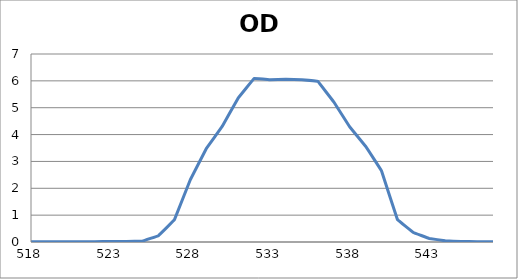
| Category | Series 0 |
|---|---|
| 2600.0 | 0.178 |
| 2599.0 | 0.178 |
| 2598.0 | 0.178 |
| 2597.0 | 0.178 |
| 2596.0 | 0.179 |
| 2595.0 | 0.179 |
| 2594.0 | 0.18 |
| 2593.0 | 0.181 |
| 2592.0 | 0.181 |
| 2591.0 | 0.182 |
| 2590.0 | 0.183 |
| 2589.0 | 0.183 |
| 2588.0 | 0.183 |
| 2587.0 | 0.184 |
| 2586.0 | 0.185 |
| 2585.0 | 0.186 |
| 2584.0 | 0.187 |
| 2583.0 | 0.188 |
| 2582.0 | 0.188 |
| 2581.0 | 0.189 |
| 2580.0 | 0.189 |
| 2579.0 | 0.189 |
| 2578.0 | 0.19 |
| 2577.0 | 0.19 |
| 2576.0 | 0.19 |
| 2575.0 | 0.19 |
| 2574.0 | 0.19 |
| 2573.0 | 0.19 |
| 2572.0 | 0.189 |
| 2571.0 | 0.189 |
| 2570.0 | 0.188 |
| 2569.0 | 0.187 |
| 2568.0 | 0.186 |
| 2567.0 | 0.184 |
| 2566.0 | 0.183 |
| 2565.0 | 0.182 |
| 2564.0 | 0.18 |
| 2563.0 | 0.179 |
| 2562.0 | 0.177 |
| 2561.0 | 0.175 |
| 2560.0 | 0.174 |
| 2559.0 | 0.172 |
| 2558.0 | 0.17 |
| 2557.0 | 0.168 |
| 2556.0 | 0.166 |
| 2555.0 | 0.164 |
| 2554.0 | 0.162 |
| 2553.0 | 0.16 |
| 2552.0 | 0.157 |
| 2551.0 | 0.155 |
| 2550.0 | 0.152 |
| 2549.0 | 0.149 |
| 2548.0 | 0.146 |
| 2547.0 | 0.143 |
| 2546.0 | 0.141 |
| 2545.0 | 0.139 |
| 2544.0 | 0.136 |
| 2543.0 | 0.134 |
| 2542.0 | 0.132 |
| 2541.0 | 0.13 |
| 2540.0 | 0.129 |
| 2539.0 | 0.128 |
| 2538.0 | 0.126 |
| 2537.0 | 0.125 |
| 2536.0 | 0.124 |
| 2535.0 | 0.122 |
| 2534.0 | 0.122 |
| 2533.0 | 0.121 |
| 2532.0 | 0.12 |
| 2531.0 | 0.119 |
| 2530.0 | 0.119 |
| 2529.0 | 0.119 |
| 2528.0 | 0.119 |
| 2527.0 | 0.118 |
| 2526.0 | 0.119 |
| 2525.0 | 0.119 |
| 2524.0 | 0.119 |
| 2523.0 | 0.119 |
| 2522.0 | 0.119 |
| 2521.0 | 0.12 |
| 2520.0 | 0.12 |
| 2519.0 | 0.121 |
| 2518.0 | 0.122 |
| 2517.0 | 0.122 |
| 2516.0 | 0.123 |
| 2515.0 | 0.123 |
| 2514.0 | 0.124 |
| 2513.0 | 0.124 |
| 2512.0 | 0.124 |
| 2511.0 | 0.125 |
| 2510.0 | 0.125 |
| 2509.0 | 0.125 |
| 2508.0 | 0.125 |
| 2507.0 | 0.125 |
| 2506.0 | 0.125 |
| 2505.0 | 0.125 |
| 2504.0 | 0.125 |
| 2503.0 | 0.124 |
| 2502.0 | 0.124 |
| 2501.0 | 0.123 |
| 2500.0 | 0.123 |
| 2499.0 | 0.122 |
| 2498.0 | 0.121 |
| 2497.0 | 0.119 |
| 2496.0 | 0.118 |
| 2495.0 | 0.117 |
| 2494.0 | 0.116 |
| 2493.0 | 0.115 |
| 2492.0 | 0.113 |
| 2491.0 | 0.112 |
| 2490.0 | 0.11 |
| 2489.0 | 0.108 |
| 2488.0 | 0.107 |
| 2487.0 | 0.105 |
| 2486.0 | 0.103 |
| 2485.0 | 0.102 |
| 2484.0 | 0.1 |
| 2483.0 | 0.098 |
| 2482.0 | 0.096 |
| 2481.0 | 0.095 |
| 2480.0 | 0.093 |
| 2479.0 | 0.091 |
| 2478.0 | 0.09 |
| 2477.0 | 0.088 |
| 2476.0 | 0.087 |
| 2475.0 | 0.085 |
| 2474.0 | 0.084 |
| 2473.0 | 0.082 |
| 2472.0 | 0.081 |
| 2471.0 | 0.08 |
| 2470.0 | 0.079 |
| 2469.0 | 0.078 |
| 2468.0 | 0.077 |
| 2467.0 | 0.076 |
| 2466.0 | 0.076 |
| 2465.0 | 0.075 |
| 2464.0 | 0.074 |
| 2463.0 | 0.074 |
| 2462.0 | 0.073 |
| 2461.0 | 0.073 |
| 2460.0 | 0.073 |
| 2459.0 | 0.073 |
| 2458.0 | 0.073 |
| 2457.0 | 0.072 |
| 2456.0 | 0.072 |
| 2455.0 | 0.072 |
| 2454.0 | 0.072 |
| 2453.0 | 0.072 |
| 2452.0 | 0.072 |
| 2451.0 | 0.073 |
| 2450.0 | 0.073 |
| 2449.0 | 0.073 |
| 2448.0 | 0.073 |
| 2447.0 | 0.073 |
| 2446.0 | 0.073 |
| 2445.0 | 0.073 |
| 2444.0 | 0.073 |
| 2443.0 | 0.073 |
| 2442.0 | 0.073 |
| 2441.0 | 0.073 |
| 2440.0 | 0.073 |
| 2439.0 | 0.074 |
| 2438.0 | 0.074 |
| 2437.0 | 0.074 |
| 2436.0 | 0.074 |
| 2435.0 | 0.074 |
| 2434.0 | 0.074 |
| 2433.0 | 0.074 |
| 2432.0 | 0.074 |
| 2431.0 | 0.074 |
| 2430.0 | 0.075 |
| 2429.0 | 0.075 |
| 2428.0 | 0.075 |
| 2427.0 | 0.075 |
| 2426.0 | 0.075 |
| 2425.0 | 0.076 |
| 2424.0 | 0.076 |
| 2423.0 | 0.076 |
| 2422.0 | 0.077 |
| 2421.0 | 0.077 |
| 2420.0 | 0.078 |
| 2419.0 | 0.078 |
| 2418.0 | 0.078 |
| 2417.0 | 0.079 |
| 2416.0 | 0.079 |
| 2415.0 | 0.079 |
| 2414.0 | 0.08 |
| 2413.0 | 0.08 |
| 2412.0 | 0.081 |
| 2411.0 | 0.081 |
| 2410.0 | 0.082 |
| 2409.0 | 0.082 |
| 2408.0 | 0.082 |
| 2407.0 | 0.082 |
| 2406.0 | 0.082 |
| 2405.0 | 0.082 |
| 2404.0 | 0.082 |
| 2403.0 | 0.082 |
| 2402.0 | 0.082 |
| 2401.0 | 0.082 |
| 2400.0 | 0.082 |
| 2399.0 | 0.082 |
| 2398.0 | 0.081 |
| 2397.0 | 0.081 |
| 2396.0 | 0.08 |
| 2395.0 | 0.08 |
| 2394.0 | 0.079 |
| 2393.0 | 0.078 |
| 2392.0 | 0.078 |
| 2391.0 | 0.077 |
| 2390.0 | 0.076 |
| 2389.0 | 0.076 |
| 2388.0 | 0.075 |
| 2387.0 | 0.074 |
| 2386.0 | 0.073 |
| 2385.0 | 0.072 |
| 2384.0 | 0.072 |
| 2383.0 | 0.071 |
| 2382.0 | 0.071 |
| 2381.0 | 0.071 |
| 2380.0 | 0.07 |
| 2379.0 | 0.07 |
| 2378.0 | 0.07 |
| 2377.0 | 0.07 |
| 2376.0 | 0.07 |
| 2375.0 | 0.071 |
| 2374.0 | 0.071 |
| 2373.0 | 0.072 |
| 2372.0 | 0.073 |
| 2371.0 | 0.074 |
| 2370.0 | 0.075 |
| 2369.0 | 0.077 |
| 2368.0 | 0.078 |
| 2367.0 | 0.08 |
| 2366.0 | 0.082 |
| 2365.0 | 0.084 |
| 2364.0 | 0.086 |
| 2363.0 | 0.088 |
| 2362.0 | 0.09 |
| 2361.0 | 0.093 |
| 2360.0 | 0.095 |
| 2359.0 | 0.098 |
| 2358.0 | 0.1 |
| 2357.0 | 0.103 |
| 2356.0 | 0.106 |
| 2355.0 | 0.108 |
| 2354.0 | 0.111 |
| 2353.0 | 0.113 |
| 2352.0 | 0.115 |
| 2351.0 | 0.118 |
| 2350.0 | 0.12 |
| 2349.0 | 0.122 |
| 2348.0 | 0.124 |
| 2347.0 | 0.125 |
| 2346.0 | 0.126 |
| 2345.0 | 0.128 |
| 2344.0 | 0.129 |
| 2343.0 | 0.129 |
| 2342.0 | 0.13 |
| 2341.0 | 0.13 |
| 2340.0 | 0.13 |
| 2339.0 | 0.13 |
| 2338.0 | 0.13 |
| 2337.0 | 0.129 |
| 2336.0 | 0.129 |
| 2335.0 | 0.128 |
| 2334.0 | 0.127 |
| 2333.0 | 0.126 |
| 2332.0 | 0.124 |
| 2331.0 | 0.122 |
| 2330.0 | 0.121 |
| 2329.0 | 0.119 |
| 2328.0 | 0.118 |
| 2327.0 | 0.116 |
| 2326.0 | 0.114 |
| 2325.0 | 0.112 |
| 2324.0 | 0.11 |
| 2323.0 | 0.108 |
| 2322.0 | 0.107 |
| 2321.0 | 0.105 |
| 2320.0 | 0.104 |
| 2319.0 | 0.103 |
| 2318.0 | 0.101 |
| 2317.0 | 0.101 |
| 2316.0 | 0.1 |
| 2315.0 | 0.099 |
| 2314.0 | 0.099 |
| 2313.0 | 0.099 |
| 2312.0 | 0.1 |
| 2311.0 | 0.1 |
| 2310.0 | 0.101 |
| 2309.0 | 0.102 |
| 2308.0 | 0.103 |
| 2307.0 | 0.105 |
| 2306.0 | 0.107 |
| 2305.0 | 0.109 |
| 2304.0 | 0.111 |
| 2303.0 | 0.113 |
| 2302.0 | 0.116 |
| 2301.0 | 0.118 |
| 2300.0 | 0.121 |
| 2299.0 | 0.124 |
| 2298.0 | 0.126 |
| 2297.0 | 0.129 |
| 2296.0 | 0.131 |
| 2295.0 | 0.134 |
| 2294.0 | 0.136 |
| 2293.0 | 0.138 |
| 2292.0 | 0.14 |
| 2291.0 | 0.142 |
| 2290.0 | 0.144 |
| 2289.0 | 0.146 |
| 2288.0 | 0.147 |
| 2287.0 | 0.148 |
| 2286.0 | 0.149 |
| 2285.0 | 0.15 |
| 2284.0 | 0.151 |
| 2283.0 | 0.151 |
| 2282.0 | 0.151 |
| 2281.0 | 0.151 |
| 2280.0 | 0.151 |
| 2279.0 | 0.15 |
| 2278.0 | 0.15 |
| 2277.0 | 0.149 |
| 2276.0 | 0.148 |
| 2275.0 | 0.147 |
| 2274.0 | 0.146 |
| 2273.0 | 0.145 |
| 2272.0 | 0.144 |
| 2271.0 | 0.143 |
| 2270.0 | 0.142 |
| 2269.0 | 0.141 |
| 2268.0 | 0.141 |
| 2267.0 | 0.14 |
| 2266.0 | 0.14 |
| 2265.0 | 0.14 |
| 2264.0 | 0.14 |
| 2263.0 | 0.14 |
| 2262.0 | 0.141 |
| 2261.0 | 0.142 |
| 2260.0 | 0.143 |
| 2259.0 | 0.144 |
| 2258.0 | 0.146 |
| 2257.0 | 0.148 |
| 2256.0 | 0.15 |
| 2255.0 | 0.152 |
| 2254.0 | 0.155 |
| 2253.0 | 0.158 |
| 2252.0 | 0.161 |
| 2251.0 | 0.164 |
| 2250.0 | 0.167 |
| 2249.0 | 0.17 |
| 2248.0 | 0.173 |
| 2247.0 | 0.176 |
| 2246.0 | 0.18 |
| 2245.0 | 0.183 |
| 2244.0 | 0.186 |
| 2243.0 | 0.189 |
| 2242.0 | 0.192 |
| 2241.0 | 0.194 |
| 2240.0 | 0.196 |
| 2239.0 | 0.198 |
| 2238.0 | 0.2 |
| 2237.0 | 0.202 |
| 2236.0 | 0.204 |
| 2235.0 | 0.205 |
| 2234.0 | 0.206 |
| 2233.0 | 0.207 |
| 2232.0 | 0.207 |
| 2231.0 | 0.207 |
| 2230.0 | 0.207 |
| 2229.0 | 0.208 |
| 2228.0 | 0.207 |
| 2227.0 | 0.207 |
| 2226.0 | 0.206 |
| 2225.0 | 0.206 |
| 2224.0 | 0.205 |
| 2223.0 | 0.205 |
| 2222.0 | 0.204 |
| 2221.0 | 0.203 |
| 2220.0 | 0.203 |
| 2219.0 | 0.202 |
| 2218.0 | 0.201 |
| 2217.0 | 0.201 |
| 2216.0 | 0.2 |
| 2215.0 | 0.199 |
| 2214.0 | 0.199 |
| 2213.0 | 0.198 |
| 2212.0 | 0.198 |
| 2211.0 | 0.197 |
| 2210.0 | 0.197 |
| 2209.0 | 0.196 |
| 2208.0 | 0.195 |
| 2207.0 | 0.194 |
| 2206.0 | 0.194 |
| 2205.0 | 0.192 |
| 2204.0 | 0.191 |
| 2203.0 | 0.19 |
| 2202.0 | 0.189 |
| 2201.0 | 0.188 |
| 2200.0 | 0.187 |
| 2199.0 | 0.186 |
| 2198.0 | 0.185 |
| 2197.0 | 0.184 |
| 2196.0 | 0.184 |
| 2195.0 | 0.184 |
| 2194.0 | 0.184 |
| 2193.0 | 0.183 |
| 2192.0 | 0.183 |
| 2191.0 | 0.183 |
| 2190.0 | 0.183 |
| 2189.0 | 0.183 |
| 2188.0 | 0.184 |
| 2187.0 | 0.183 |
| 2186.0 | 0.183 |
| 2185.0 | 0.182 |
| 2184.0 | 0.182 |
| 2183.0 | 0.181 |
| 2182.0 | 0.18 |
| 2181.0 | 0.179 |
| 2180.0 | 0.178 |
| 2179.0 | 0.177 |
| 2178.0 | 0.175 |
| 2177.0 | 0.173 |
| 2176.0 | 0.171 |
| 2175.0 | 0.17 |
| 2174.0 | 0.168 |
| 2173.0 | 0.165 |
| 2172.0 | 0.163 |
| 2171.0 | 0.162 |
| 2170.0 | 0.16 |
| 2169.0 | 0.158 |
| 2168.0 | 0.157 |
| 2167.0 | 0.155 |
| 2166.0 | 0.154 |
| 2165.0 | 0.153 |
| 2164.0 | 0.153 |
| 2163.0 | 0.152 |
| 2162.0 | 0.152 |
| 2161.0 | 0.152 |
| 2160.0 | 0.153 |
| 2159.0 | 0.153 |
| 2158.0 | 0.154 |
| 2157.0 | 0.156 |
| 2156.0 | 0.157 |
| 2155.0 | 0.159 |
| 2154.0 | 0.161 |
| 2153.0 | 0.163 |
| 2152.0 | 0.164 |
| 2151.0 | 0.166 |
| 2150.0 | 0.168 |
| 2149.0 | 0.17 |
| 2148.0 | 0.172 |
| 2147.0 | 0.173 |
| 2146.0 | 0.175 |
| 2145.0 | 0.176 |
| 2144.0 | 0.176 |
| 2143.0 | 0.177 |
| 2142.0 | 0.177 |
| 2141.0 | 0.177 |
| 2140.0 | 0.176 |
| 2139.0 | 0.175 |
| 2138.0 | 0.173 |
| 2137.0 | 0.171 |
| 2136.0 | 0.169 |
| 2135.0 | 0.167 |
| 2134.0 | 0.164 |
| 2133.0 | 0.161 |
| 2132.0 | 0.157 |
| 2131.0 | 0.153 |
| 2130.0 | 0.15 |
| 2129.0 | 0.146 |
| 2128.0 | 0.142 |
| 2127.0 | 0.138 |
| 2126.0 | 0.134 |
| 2125.0 | 0.13 |
| 2124.0 | 0.126 |
| 2123.0 | 0.122 |
| 2122.0 | 0.119 |
| 2121.0 | 0.116 |
| 2120.0 | 0.114 |
| 2119.0 | 0.112 |
| 2118.0 | 0.111 |
| 2117.0 | 0.111 |
| 2116.0 | 0.111 |
| 2115.0 | 0.112 |
| 2114.0 | 0.113 |
| 2113.0 | 0.115 |
| 2112.0 | 0.118 |
| 2111.0 | 0.122 |
| 2110.0 | 0.125 |
| 2109.0 | 0.13 |
| 2108.0 | 0.135 |
| 2107.0 | 0.14 |
| 2106.0 | 0.145 |
| 2105.0 | 0.15 |
| 2104.0 | 0.155 |
| 2103.0 | 0.161 |
| 2102.0 | 0.166 |
| 2101.0 | 0.171 |
| 2100.0 | 0.175 |
| 2099.0 | 0.179 |
| 2098.0 | 0.183 |
| 2097.0 | 0.187 |
| 2096.0 | 0.189 |
| 2095.0 | 0.192 |
| 2094.0 | 0.193 |
| 2093.0 | 0.195 |
| 2092.0 | 0.195 |
| 2091.0 | 0.195 |
| 2090.0 | 0.194 |
| 2089.0 | 0.193 |
| 2088.0 | 0.191 |
| 2087.0 | 0.189 |
| 2086.0 | 0.186 |
| 2085.0 | 0.182 |
| 2084.0 | 0.178 |
| 2083.0 | 0.174 |
| 2082.0 | 0.169 |
| 2081.0 | 0.164 |
| 2080.0 | 0.159 |
| 2079.0 | 0.154 |
| 2078.0 | 0.149 |
| 2077.0 | 0.144 |
| 2076.0 | 0.139 |
| 2075.0 | 0.134 |
| 2074.0 | 0.13 |
| 2073.0 | 0.126 |
| 2072.0 | 0.123 |
| 2071.0 | 0.121 |
| 2070.0 | 0.119 |
| 2069.0 | 0.117 |
| 2068.0 | 0.117 |
| 2067.0 | 0.117 |
| 2066.0 | 0.118 |
| 2065.0 | 0.12 |
| 2064.0 | 0.122 |
| 2063.0 | 0.125 |
| 2062.0 | 0.128 |
| 2061.0 | 0.132 |
| 2060.0 | 0.135 |
| 2059.0 | 0.139 |
| 2058.0 | 0.143 |
| 2057.0 | 0.147 |
| 2056.0 | 0.151 |
| 2055.0 | 0.155 |
| 2054.0 | 0.158 |
| 2053.0 | 0.161 |
| 2052.0 | 0.164 |
| 2051.0 | 0.167 |
| 2050.0 | 0.168 |
| 2049.0 | 0.169 |
| 2048.0 | 0.17 |
| 2047.0 | 0.171 |
| 2046.0 | 0.17 |
| 2045.0 | 0.169 |
| 2044.0 | 0.168 |
| 2043.0 | 0.165 |
| 2042.0 | 0.163 |
| 2041.0 | 0.16 |
| 2040.0 | 0.156 |
| 2039.0 | 0.152 |
| 2038.0 | 0.148 |
| 2037.0 | 0.144 |
| 2036.0 | 0.139 |
| 2035.0 | 0.135 |
| 2034.0 | 0.131 |
| 2033.0 | 0.127 |
| 2032.0 | 0.123 |
| 2031.0 | 0.119 |
| 2030.0 | 0.116 |
| 2029.0 | 0.114 |
| 2028.0 | 0.112 |
| 2027.0 | 0.111 |
| 2026.0 | 0.11 |
| 2025.0 | 0.11 |
| 2024.0 | 0.111 |
| 2023.0 | 0.113 |
| 2022.0 | 0.115 |
| 2021.0 | 0.117 |
| 2020.0 | 0.121 |
| 2019.0 | 0.124 |
| 2018.0 | 0.128 |
| 2017.0 | 0.132 |
| 2016.0 | 0.135 |
| 2015.0 | 0.139 |
| 2014.0 | 0.143 |
| 2013.0 | 0.147 |
| 2012.0 | 0.15 |
| 2011.0 | 0.153 |
| 2010.0 | 0.156 |
| 2009.0 | 0.158 |
| 2008.0 | 0.16 |
| 2007.0 | 0.161 |
| 2006.0 | 0.162 |
| 2005.0 | 0.163 |
| 2004.0 | 0.162 |
| 2003.0 | 0.162 |
| 2002.0 | 0.161 |
| 2001.0 | 0.16 |
| 2000.0 | 0.158 |
| 1999.0 | 0.156 |
| 1998.0 | 0.154 |
| 1997.0 | 0.152 |
| 1996.0 | 0.15 |
| 1995.0 | 0.147 |
| 1994.0 | 0.146 |
| 1993.0 | 0.145 |
| 1992.0 | 0.144 |
| 1991.0 | 0.144 |
| 1990.0 | 0.144 |
| 1989.0 | 0.146 |
| 1988.0 | 0.148 |
| 1987.0 | 0.151 |
| 1986.0 | 0.155 |
| 1985.0 | 0.159 |
| 1984.0 | 0.165 |
| 1983.0 | 0.171 |
| 1982.0 | 0.177 |
| 1981.0 | 0.184 |
| 1980.0 | 0.192 |
| 1979.0 | 0.199 |
| 1978.0 | 0.207 |
| 1977.0 | 0.215 |
| 1976.0 | 0.222 |
| 1975.0 | 0.229 |
| 1974.0 | 0.236 |
| 1973.0 | 0.243 |
| 1972.0 | 0.249 |
| 1971.0 | 0.255 |
| 1970.0 | 0.259 |
| 1969.0 | 0.264 |
| 1968.0 | 0.267 |
| 1967.0 | 0.269 |
| 1966.0 | 0.27 |
| 1965.0 | 0.271 |
| 1964.0 | 0.271 |
| 1963.0 | 0.269 |
| 1962.0 | 0.267 |
| 1961.0 | 0.264 |
| 1960.0 | 0.259 |
| 1959.0 | 0.254 |
| 1958.0 | 0.248 |
| 1957.0 | 0.241 |
| 1956.0 | 0.234 |
| 1955.0 | 0.226 |
| 1954.0 | 0.218 |
| 1953.0 | 0.21 |
| 1952.0 | 0.201 |
| 1951.0 | 0.193 |
| 1950.0 | 0.184 |
| 1949.0 | 0.177 |
| 1948.0 | 0.169 |
| 1947.0 | 0.162 |
| 1946.0 | 0.156 |
| 1945.0 | 0.151 |
| 1944.0 | 0.147 |
| 1943.0 | 0.144 |
| 1942.0 | 0.142 |
| 1941.0 | 0.141 |
| 1940.0 | 0.141 |
| 1939.0 | 0.142 |
| 1938.0 | 0.144 |
| 1937.0 | 0.146 |
| 1936.0 | 0.149 |
| 1935.0 | 0.152 |
| 1934.0 | 0.156 |
| 1933.0 | 0.159 |
| 1932.0 | 0.163 |
| 1931.0 | 0.167 |
| 1930.0 | 0.171 |
| 1929.0 | 0.175 |
| 1928.0 | 0.178 |
| 1927.0 | 0.181 |
| 1926.0 | 0.184 |
| 1925.0 | 0.186 |
| 1924.0 | 0.187 |
| 1923.0 | 0.187 |
| 1922.0 | 0.187 |
| 1921.0 | 0.187 |
| 1920.0 | 0.186 |
| 1919.0 | 0.184 |
| 1918.0 | 0.182 |
| 1917.0 | 0.179 |
| 1916.0 | 0.176 |
| 1915.0 | 0.172 |
| 1914.0 | 0.168 |
| 1913.0 | 0.164 |
| 1912.0 | 0.16 |
| 1911.0 | 0.155 |
| 1910.0 | 0.151 |
| 1909.0 | 0.147 |
| 1908.0 | 0.143 |
| 1907.0 | 0.139 |
| 1906.0 | 0.135 |
| 1905.0 | 0.131 |
| 1904.0 | 0.128 |
| 1903.0 | 0.125 |
| 1902.0 | 0.122 |
| 1901.0 | 0.119 |
| 1900.0 | 0.116 |
| 1899.0 | 0.113 |
| 1898.0 | 0.111 |
| 1897.0 | 0.108 |
| 1896.0 | 0.105 |
| 1895.0 | 0.103 |
| 1894.0 | 0.099 |
| 1893.0 | 0.096 |
| 1892.0 | 0.093 |
| 1891.0 | 0.09 |
| 1890.0 | 0.087 |
| 1889.0 | 0.083 |
| 1888.0 | 0.08 |
| 1887.0 | 0.076 |
| 1886.0 | 0.073 |
| 1885.0 | 0.07 |
| 1884.0 | 0.067 |
| 1883.0 | 0.064 |
| 1882.0 | 0.062 |
| 1881.0 | 0.06 |
| 1880.0 | 0.059 |
| 1879.0 | 0.059 |
| 1878.0 | 0.06 |
| 1877.0 | 0.062 |
| 1876.0 | 0.065 |
| 1875.0 | 0.069 |
| 1874.0 | 0.075 |
| 1873.0 | 0.081 |
| 1872.0 | 0.089 |
| 1871.0 | 0.096 |
| 1870.0 | 0.104 |
| 1869.0 | 0.113 |
| 1868.0 | 0.122 |
| 1867.0 | 0.13 |
| 1866.0 | 0.138 |
| 1865.0 | 0.145 |
| 1864.0 | 0.151 |
| 1863.0 | 0.157 |
| 1862.0 | 0.163 |
| 1861.0 | 0.169 |
| 1860.0 | 0.173 |
| 1859.0 | 0.177 |
| 1858.0 | 0.179 |
| 1857.0 | 0.179 |
| 1856.0 | 0.179 |
| 1855.0 | 0.177 |
| 1854.0 | 0.174 |
| 1853.0 | 0.17 |
| 1852.0 | 0.165 |
| 1851.0 | 0.16 |
| 1850.0 | 0.154 |
| 1849.0 | 0.145 |
| 1848.0 | 0.135 |
| 1847.0 | 0.125 |
| 1846.0 | 0.115 |
| 1845.0 | 0.108 |
| 1844.0 | 0.099 |
| 1843.0 | 0.09 |
| 1842.0 | 0.081 |
| 1841.0 | 0.073 |
| 1840.0 | 0.066 |
| 1839.0 | 0.061 |
| 1838.0 | 0.057 |
| 1837.0 | 0.054 |
| 1836.0 | 0.054 |
| 1835.0 | 0.054 |
| 1834.0 | 0.056 |
| 1833.0 | 0.059 |
| 1832.0 | 0.063 |
| 1831.0 | 0.069 |
| 1830.0 | 0.075 |
| 1829.0 | 0.083 |
| 1828.0 | 0.089 |
| 1827.0 | 0.096 |
| 1826.0 | 0.103 |
| 1825.0 | 0.109 |
| 1824.0 | 0.114 |
| 1823.0 | 0.117 |
| 1822.0 | 0.121 |
| 1821.0 | 0.124 |
| 1820.0 | 0.126 |
| 1819.0 | 0.127 |
| 1818.0 | 0.126 |
| 1817.0 | 0.124 |
| 1816.0 | 0.121 |
| 1815.0 | 0.117 |
| 1814.0 | 0.112 |
| 1813.0 | 0.107 |
| 1812.0 | 0.101 |
| 1811.0 | 0.094 |
| 1810.0 | 0.087 |
| 1809.0 | 0.081 |
| 1808.0 | 0.074 |
| 1807.0 | 0.069 |
| 1806.0 | 0.063 |
| 1805.0 | 0.058 |
| 1804.0 | 0.054 |
| 1803.0 | 0.051 |
| 1802.0 | 0.049 |
| 1801.0 | 0.048 |
| 1800.0 | 0.049 |
| 1799.0 | 0.051 |
| 1798.0 | 0.054 |
| 1797.0 | 0.057 |
| 1796.0 | 0.061 |
| 1795.0 | 0.066 |
| 1794.0 | 0.071 |
| 1793.0 | 0.077 |
| 1792.0 | 0.082 |
| 1791.0 | 0.087 |
| 1790.0 | 0.091 |
| 1789.0 | 0.094 |
| 1788.0 | 0.097 |
| 1787.0 | 0.099 |
| 1786.0 | 0.101 |
| 1785.0 | 0.101 |
| 1784.0 | 0.101 |
| 1783.0 | 0.099 |
| 1782.0 | 0.097 |
| 1781.0 | 0.095 |
| 1780.0 | 0.091 |
| 1779.0 | 0.088 |
| 1778.0 | 0.084 |
| 1777.0 | 0.08 |
| 1776.0 | 0.077 |
| 1775.0 | 0.073 |
| 1774.0 | 0.071 |
| 1773.0 | 0.068 |
| 1772.0 | 0.067 |
| 1771.0 | 0.066 |
| 1770.0 | 0.066 |
| 1769.0 | 0.067 |
| 1768.0 | 0.069 |
| 1767.0 | 0.071 |
| 1766.0 | 0.075 |
| 1765.0 | 0.079 |
| 1764.0 | 0.083 |
| 1763.0 | 0.088 |
| 1762.0 | 0.093 |
| 1761.0 | 0.098 |
| 1760.0 | 0.103 |
| 1759.0 | 0.108 |
| 1758.0 | 0.112 |
| 1757.0 | 0.115 |
| 1756.0 | 0.118 |
| 1755.0 | 0.12 |
| 1754.0 | 0.121 |
| 1753.0 | 0.121 |
| 1752.0 | 0.121 |
| 1751.0 | 0.119 |
| 1750.0 | 0.117 |
| 1749.0 | 0.114 |
| 1748.0 | 0.111 |
| 1747.0 | 0.107 |
| 1746.0 | 0.103 |
| 1745.0 | 0.098 |
| 1744.0 | 0.094 |
| 1743.0 | 0.089 |
| 1742.0 | 0.085 |
| 1741.0 | 0.081 |
| 1740.0 | 0.078 |
| 1739.0 | 0.075 |
| 1738.0 | 0.072 |
| 1737.0 | 0.07 |
| 1736.0 | 0.069 |
| 1735.0 | 0.068 |
| 1734.0 | 0.068 |
| 1733.0 | 0.067 |
| 1732.0 | 0.067 |
| 1731.0 | 0.068 |
| 1730.0 | 0.068 |
| 1729.0 | 0.068 |
| 1728.0 | 0.068 |
| 1727.0 | 0.068 |
| 1726.0 | 0.067 |
| 1725.0 | 0.067 |
| 1724.0 | 0.066 |
| 1723.0 | 0.064 |
| 1722.0 | 0.063 |
| 1721.0 | 0.061 |
| 1720.0 | 0.058 |
| 1719.0 | 0.056 |
| 1718.0 | 0.053 |
| 1717.0 | 0.051 |
| 1716.0 | 0.048 |
| 1715.0 | 0.046 |
| 1714.0 | 0.044 |
| 1713.0 | 0.042 |
| 1712.0 | 0.041 |
| 1711.0 | 0.041 |
| 1710.0 | 0.04 |
| 1709.0 | 0.04 |
| 1708.0 | 0.041 |
| 1707.0 | 0.042 |
| 1706.0 | 0.043 |
| 1705.0 | 0.045 |
| 1704.0 | 0.046 |
| 1703.0 | 0.048 |
| 1702.0 | 0.049 |
| 1701.0 | 0.05 |
| 1700.0 | 0.051 |
| 1699.0 | 0.051 |
| 1698.0 | 0.051 |
| 1697.0 | 0.051 |
| 1696.0 | 0.051 |
| 1695.0 | 0.05 |
| 1694.0 | 0.049 |
| 1693.0 | 0.048 |
| 1692.0 | 0.047 |
| 1691.0 | 0.046 |
| 1690.0 | 0.045 |
| 1689.0 | 0.045 |
| 1688.0 | 0.045 |
| 1687.0 | 0.045 |
| 1686.0 | 0.046 |
| 1685.0 | 0.048 |
| 1684.0 | 0.051 |
| 1683.0 | 0.054 |
| 1682.0 | 0.058 |
| 1681.0 | 0.063 |
| 1680.0 | 0.068 |
| 1679.0 | 0.073 |
| 1678.0 | 0.078 |
| 1677.0 | 0.083 |
| 1676.0 | 0.087 |
| 1675.0 | 0.092 |
| 1674.0 | 0.095 |
| 1673.0 | 0.098 |
| 1672.0 | 0.099 |
| 1671.0 | 0.1 |
| 1670.0 | 0.099 |
| 1669.0 | 0.098 |
| 1668.0 | 0.095 |
| 1667.0 | 0.092 |
| 1666.0 | 0.087 |
| 1665.0 | 0.083 |
| 1664.0 | 0.077 |
| 1663.0 | 0.072 |
| 1662.0 | 0.067 |
| 1661.0 | 0.062 |
| 1660.0 | 0.057 |
| 1659.0 | 0.054 |
| 1658.0 | 0.051 |
| 1657.0 | 0.05 |
| 1656.0 | 0.049 |
| 1655.0 | 0.05 |
| 1654.0 | 0.052 |
| 1653.0 | 0.055 |
| 1652.0 | 0.059 |
| 1651.0 | 0.064 |
| 1650.0 | 0.069 |
| 1649.0 | 0.075 |
| 1648.0 | 0.08 |
| 1647.0 | 0.085 |
| 1646.0 | 0.09 |
| 1645.0 | 0.094 |
| 1644.0 | 0.096 |
| 1643.0 | 0.098 |
| 1642.0 | 0.099 |
| 1641.0 | 0.098 |
| 1640.0 | 0.096 |
| 1639.0 | 0.093 |
| 1638.0 | 0.088 |
| 1637.0 | 0.083 |
| 1636.0 | 0.077 |
| 1635.0 | 0.07 |
| 1634.0 | 0.062 |
| 1633.0 | 0.055 |
| 1632.0 | 0.048 |
| 1631.0 | 0.042 |
| 1630.0 | 0.037 |
| 1629.0 | 0.033 |
| 1628.0 | 0.031 |
| 1627.0 | 0.029 |
| 1626.0 | 0.03 |
| 1625.0 | 0.031 |
| 1624.0 | 0.034 |
| 1623.0 | 0.037 |
| 1622.0 | 0.042 |
| 1621.0 | 0.046 |
| 1620.0 | 0.051 |
| 1619.0 | 0.055 |
| 1618.0 | 0.059 |
| 1617.0 | 0.063 |
| 1616.0 | 0.065 |
| 1615.0 | 0.067 |
| 1614.0 | 0.068 |
| 1613.0 | 0.068 |
| 1612.0 | 0.067 |
| 1611.0 | 0.065 |
| 1610.0 | 0.062 |
| 1609.0 | 0.059 |
| 1608.0 | 0.056 |
| 1607.0 | 0.053 |
| 1606.0 | 0.05 |
| 1605.0 | 0.047 |
| 1604.0 | 0.045 |
| 1603.0 | 0.044 |
| 1602.0 | 0.044 |
| 1601.0 | 0.044 |
| 1600.0 | 0.046 |
| 1599.0 | 0.049 |
| 1598.0 | 0.052 |
| 1597.0 | 0.056 |
| 1596.0 | 0.06 |
| 1595.0 | 0.064 |
| 1594.0 | 0.068 |
| 1593.0 | 0.072 |
| 1592.0 | 0.075 |
| 1591.0 | 0.077 |
| 1590.0 | 0.078 |
| 1589.0 | 0.078 |
| 1588.0 | 0.077 |
| 1587.0 | 0.075 |
| 1586.0 | 0.072 |
| 1585.0 | 0.069 |
| 1584.0 | 0.066 |
| 1583.0 | 0.062 |
| 1582.0 | 0.059 |
| 1581.0 | 0.056 |
| 1580.0 | 0.055 |
| 1579.0 | 0.054 |
| 1578.0 | 0.054 |
| 1577.0 | 0.056 |
| 1576.0 | 0.058 |
| 1575.0 | 0.062 |
| 1574.0 | 0.067 |
| 1573.0 | 0.072 |
| 1572.0 | 0.078 |
| 1571.0 | 0.083 |
| 1570.0 | 0.089 |
| 1569.0 | 0.094 |
| 1568.0 | 0.098 |
| 1567.0 | 0.102 |
| 1566.0 | 0.104 |
| 1565.0 | 0.105 |
| 1564.0 | 0.105 |
| 1563.0 | 0.103 |
| 1562.0 | 0.101 |
| 1561.0 | 0.097 |
| 1560.0 | 0.092 |
| 1559.0 | 0.087 |
| 1558.0 | 0.082 |
| 1557.0 | 0.077 |
| 1556.0 | 0.073 |
| 1555.0 | 0.07 |
| 1554.0 | 0.068 |
| 1553.0 | 0.068 |
| 1552.0 | 0.069 |
| 1551.0 | 0.073 |
| 1550.0 | 0.077 |
| 1549.0 | 0.083 |
| 1548.0 | 0.09 |
| 1547.0 | 0.097 |
| 1546.0 | 0.105 |
| 1545.0 | 0.112 |
| 1544.0 | 0.118 |
| 1543.0 | 0.123 |
| 1542.0 | 0.127 |
| 1541.0 | 0.129 |
| 1540.0 | 0.129 |
| 1539.0 | 0.128 |
| 1538.0 | 0.125 |
| 1537.0 | 0.121 |
| 1536.0 | 0.115 |
| 1535.0 | 0.108 |
| 1534.0 | 0.1 |
| 1533.0 | 0.092 |
| 1532.0 | 0.083 |
| 1531.0 | 0.075 |
| 1530.0 | 0.068 |
| 1529.0 | 0.062 |
| 1528.0 | 0.057 |
| 1527.0 | 0.054 |
| 1526.0 | 0.053 |
| 1525.0 | 0.053 |
| 1524.0 | 0.055 |
| 1523.0 | 0.058 |
| 1522.0 | 0.062 |
| 1521.0 | 0.066 |
| 1520.0 | 0.071 |
| 1519.0 | 0.076 |
| 1518.0 | 0.079 |
| 1517.0 | 0.082 |
| 1516.0 | 0.085 |
| 1515.0 | 0.086 |
| 1514.0 | 0.085 |
| 1513.0 | 0.084 |
| 1512.0 | 0.082 |
| 1511.0 | 0.08 |
| 1510.0 | 0.077 |
| 1509.0 | 0.074 |
| 1508.0 | 0.072 |
| 1507.0 | 0.069 |
| 1506.0 | 0.068 |
| 1505.0 | 0.068 |
| 1504.0 | 0.069 |
| 1503.0 | 0.07 |
| 1502.0 | 0.072 |
| 1501.0 | 0.075 |
| 1500.0 | 0.078 |
| 1499.0 | 0.081 |
| 1498.0 | 0.084 |
| 1497.0 | 0.086 |
| 1496.0 | 0.088 |
| 1495.0 | 0.09 |
| 1494.0 | 0.09 |
| 1493.0 | 0.091 |
| 1492.0 | 0.09 |
| 1491.0 | 0.09 |
| 1490.0 | 0.089 |
| 1489.0 | 0.088 |
| 1488.0 | 0.088 |
| 1487.0 | 0.088 |
| 1486.0 | 0.089 |
| 1485.0 | 0.092 |
| 1484.0 | 0.095 |
| 1483.0 | 0.099 |
| 1482.0 | 0.104 |
| 1481.0 | 0.11 |
| 1480.0 | 0.116 |
| 1479.0 | 0.123 |
| 1478.0 | 0.128 |
| 1477.0 | 0.134 |
| 1476.0 | 0.138 |
| 1475.0 | 0.14 |
| 1474.0 | 0.141 |
| 1473.0 | 0.14 |
| 1472.0 | 0.138 |
| 1471.0 | 0.135 |
| 1470.0 | 0.13 |
| 1469.0 | 0.125 |
| 1468.0 | 0.119 |
| 1467.0 | 0.114 |
| 1466.0 | 0.11 |
| 1465.0 | 0.107 |
| 1464.0 | 0.107 |
| 1463.0 | 0.108 |
| 1462.0 | 0.111 |
| 1461.0 | 0.116 |
| 1460.0 | 0.124 |
| 1459.0 | 0.132 |
| 1458.0 | 0.142 |
| 1457.0 | 0.151 |
| 1456.0 | 0.16 |
| 1455.0 | 0.168 |
| 1454.0 | 0.175 |
| 1453.0 | 0.18 |
| 1452.0 | 0.183 |
| 1451.0 | 0.184 |
| 1450.0 | 0.183 |
| 1449.0 | 0.179 |
| 1448.0 | 0.174 |
| 1447.0 | 0.166 |
| 1446.0 | 0.157 |
| 1445.0 | 0.148 |
| 1444.0 | 0.139 |
| 1443.0 | 0.131 |
| 1442.0 | 0.123 |
| 1441.0 | 0.117 |
| 1440.0 | 0.113 |
| 1439.0 | 0.112 |
| 1438.0 | 0.112 |
| 1437.0 | 0.115 |
| 1436.0 | 0.12 |
| 1435.0 | 0.125 |
| 1434.0 | 0.13 |
| 1433.0 | 0.136 |
| 1432.0 | 0.14 |
| 1431.0 | 0.144 |
| 1430.0 | 0.146 |
| 1429.0 | 0.147 |
| 1428.0 | 0.146 |
| 1427.0 | 0.144 |
| 1426.0 | 0.141 |
| 1425.0 | 0.138 |
| 1424.0 | 0.135 |
| 1423.0 | 0.132 |
| 1422.0 | 0.13 |
| 1421.0 | 0.129 |
| 1420.0 | 0.13 |
| 1419.0 | 0.132 |
| 1418.0 | 0.135 |
| 1417.0 | 0.139 |
| 1416.0 | 0.143 |
| 1415.0 | 0.148 |
| 1414.0 | 0.153 |
| 1413.0 | 0.157 |
| 1412.0 | 0.161 |
| 1411.0 | 0.163 |
| 1410.0 | 0.164 |
| 1409.0 | 0.164 |
| 1408.0 | 0.165 |
| 1407.0 | 0.165 |
| 1406.0 | 0.165 |
| 1405.0 | 0.166 |
| 1404.0 | 0.169 |
| 1403.0 | 0.173 |
| 1402.0 | 0.178 |
| 1401.0 | 0.186 |
| 1400.0 | 0.197 |
| 1399.0 | 0.209 |
| 1398.0 | 0.22 |
| 1397.0 | 0.23 |
| 1396.0 | 0.241 |
| 1395.0 | 0.253 |
| 1394.0 | 0.262 |
| 1393.0 | 0.267 |
| 1392.0 | 0.27 |
| 1391.0 | 0.27 |
| 1390.0 | 0.268 |
| 1389.0 | 0.264 |
| 1388.0 | 0.259 |
| 1387.0 | 0.254 |
| 1386.0 | 0.251 |
| 1385.0 | 0.248 |
| 1384.0 | 0.247 |
| 1383.0 | 0.25 |
| 1382.0 | 0.257 |
| 1381.0 | 0.269 |
| 1380.0 | 0.281 |
| 1379.0 | 0.293 |
| 1378.0 | 0.307 |
| 1377.0 | 0.321 |
| 1376.0 | 0.334 |
| 1375.0 | 0.345 |
| 1374.0 | 0.355 |
| 1373.0 | 0.361 |
| 1372.0 | 0.364 |
| 1371.0 | 0.364 |
| 1370.0 | 0.361 |
| 1369.0 | 0.354 |
| 1368.0 | 0.343 |
| 1367.0 | 0.331 |
| 1366.0 | 0.318 |
| 1365.0 | 0.303 |
| 1364.0 | 0.29 |
| 1363.0 | 0.28 |
| 1362.0 | 0.272 |
| 1361.0 | 0.269 |
| 1360.0 | 0.271 |
| 1359.0 | 0.276 |
| 1358.0 | 0.283 |
| 1357.0 | 0.291 |
| 1356.0 | 0.301 |
| 1355.0 | 0.311 |
| 1354.0 | 0.321 |
| 1353.0 | 0.328 |
| 1352.0 | 0.33 |
| 1351.0 | 0.329 |
| 1350.0 | 0.324 |
| 1349.0 | 0.317 |
| 1348.0 | 0.309 |
| 1347.0 | 0.298 |
| 1346.0 | 0.286 |
| 1345.0 | 0.275 |
| 1344.0 | 0.267 |
| 1343.0 | 0.261 |
| 1342.0 | 0.258 |
| 1341.0 | 0.257 |
| 1340.0 | 0.26 |
| 1339.0 | 0.265 |
| 1338.0 | 0.271 |
| 1337.0 | 0.277 |
| 1336.0 | 0.283 |
| 1335.0 | 0.287 |
| 1334.0 | 0.29 |
| 1333.0 | 0.29 |
| 1332.0 | 0.287 |
| 1331.0 | 0.282 |
| 1330.0 | 0.275 |
| 1329.0 | 0.267 |
| 1328.0 | 0.259 |
| 1327.0 | 0.251 |
| 1326.0 | 0.245 |
| 1325.0 | 0.242 |
| 1324.0 | 0.241 |
| 1323.0 | 0.243 |
| 1322.0 | 0.248 |
| 1321.0 | 0.255 |
| 1320.0 | 0.263 |
| 1319.0 | 0.271 |
| 1318.0 | 0.277 |
| 1317.0 | 0.282 |
| 1316.0 | 0.284 |
| 1315.0 | 0.284 |
| 1314.0 | 0.281 |
| 1313.0 | 0.276 |
| 1312.0 | 0.269 |
| 1311.0 | 0.263 |
| 1310.0 | 0.257 |
| 1309.0 | 0.254 |
| 1308.0 | 0.254 |
| 1307.0 | 0.257 |
| 1306.0 | 0.263 |
| 1305.0 | 0.273 |
| 1304.0 | 0.284 |
| 1303.0 | 0.296 |
| 1302.0 | 0.308 |
| 1301.0 | 0.319 |
| 1300.0 | 0.327 |
| 1299.0 | 0.333 |
| 1298.0 | 0.335 |
| 1297.0 | 0.334 |
| 1296.0 | 0.331 |
| 1295.0 | 0.325 |
| 1294.0 | 0.317 |
| 1293.0 | 0.31 |
| 1292.0 | 0.303 |
| 1291.0 | 0.297 |
| 1290.0 | 0.295 |
| 1289.0 | 0.295 |
| 1288.0 | 0.298 |
| 1287.0 | 0.304 |
| 1286.0 | 0.313 |
| 1285.0 | 0.323 |
| 1284.0 | 0.333 |
| 1283.0 | 0.341 |
| 1282.0 | 0.348 |
| 1281.0 | 0.352 |
| 1280.0 | 0.353 |
| 1279.0 | 0.351 |
| 1278.0 | 0.346 |
| 1277.0 | 0.339 |
| 1276.0 | 0.331 |
| 1275.0 | 0.322 |
| 1274.0 | 0.314 |
| 1273.0 | 0.306 |
| 1272.0 | 0.301 |
| 1271.0 | 0.297 |
| 1270.0 | 0.295 |
| 1269.0 | 0.295 |
| 1268.0 | 0.296 |
| 1267.0 | 0.298 |
| 1266.0 | 0.299 |
| 1265.0 | 0.3 |
| 1264.0 | 0.3 |
| 1263.0 | 0.3 |
| 1262.0 | 0.299 |
| 1261.0 | 0.298 |
| 1260.0 | 0.296 |
| 1259.0 | 0.296 |
| 1258.0 | 0.296 |
| 1257.0 | 0.297 |
| 1256.0 | 0.299 |
| 1255.0 | 0.301 |
| 1254.0 | 0.304 |
| 1253.0 | 0.307 |
| 1252.0 | 0.309 |
| 1251.0 | 0.311 |
| 1250.0 | 0.312 |
| 1249.0 | 0.312 |
| 1248.0 | 0.311 |
| 1247.0 | 0.31 |
| 1246.0 | 0.308 |
| 1245.0 | 0.308 |
| 1244.0 | 0.309 |
| 1243.0 | 0.312 |
| 1242.0 | 0.316 |
| 1241.0 | 0.322 |
| 1240.0 | 0.329 |
| 1239.0 | 0.337 |
| 1238.0 | 0.344 |
| 1237.0 | 0.349 |
| 1236.0 | 0.354 |
| 1235.0 | 0.355 |
| 1234.0 | 0.355 |
| 1233.0 | 0.352 |
| 1232.0 | 0.348 |
| 1231.0 | 0.344 |
| 1230.0 | 0.339 |
| 1229.0 | 0.336 |
| 1228.0 | 0.335 |
| 1227.0 | 0.337 |
| 1226.0 | 0.341 |
| 1225.0 | 0.346 |
| 1224.0 | 0.354 |
| 1223.0 | 0.361 |
| 1222.0 | 0.367 |
| 1221.0 | 0.373 |
| 1220.0 | 0.376 |
| 1219.0 | 0.376 |
| 1218.0 | 0.374 |
| 1217.0 | 0.37 |
| 1216.0 | 0.364 |
| 1215.0 | 0.357 |
| 1214.0 | 0.349 |
| 1213.0 | 0.343 |
| 1212.0 | 0.338 |
| 1211.0 | 0.335 |
| 1210.0 | 0.334 |
| 1209.0 | 0.335 |
| 1208.0 | 0.337 |
| 1207.0 | 0.341 |
| 1206.0 | 0.344 |
| 1205.0 | 0.347 |
| 1204.0 | 0.348 |
| 1203.0 | 0.349 |
| 1202.0 | 0.349 |
| 1201.0 | 0.348 |
| 1200.0 | 0.346 |
| 1199.0 | 0.345 |
| 1198.0 | 0.344 |
| 1197.0 | 0.344 |
| 1196.0 | 0.344 |
| 1195.0 | 0.345 |
| 1194.0 | 0.346 |
| 1193.0 | 0.347 |
| 1192.0 | 0.348 |
| 1191.0 | 0.348 |
| 1190.0 | 0.348 |
| 1189.0 | 0.347 |
| 1188.0 | 0.347 |
| 1187.0 | 0.348 |
| 1186.0 | 0.349 |
| 1185.0 | 0.352 |
| 1184.0 | 0.357 |
| 1183.0 | 0.362 |
| 1182.0 | 0.368 |
| 1181.0 | 0.373 |
| 1180.0 | 0.378 |
| 1179.0 | 0.381 |
| 1178.0 | 0.382 |
| 1177.0 | 0.381 |
| 1176.0 | 0.378 |
| 1175.0 | 0.375 |
| 1174.0 | 0.371 |
| 1173.0 | 0.368 |
| 1172.0 | 0.367 |
| 1171.0 | 0.369 |
| 1170.0 | 0.372 |
| 1169.0 | 0.378 |
| 1168.0 | 0.385 |
| 1167.0 | 0.393 |
| 1166.0 | 0.401 |
| 1165.0 | 0.407 |
| 1164.0 | 0.41 |
| 1163.0 | 0.411 |
| 1162.0 | 0.408 |
| 1161.0 | 0.404 |
| 1160.0 | 0.398 |
| 1159.0 | 0.392 |
| 1158.0 | 0.387 |
| 1157.0 | 0.383 |
| 1156.0 | 0.382 |
| 1155.0 | 0.383 |
| 1154.0 | 0.386 |
| 1153.0 | 0.39 |
| 1152.0 | 0.393 |
| 1151.0 | 0.395 |
| 1150.0 | 0.395 |
| 1149.0 | 0.394 |
| 1148.0 | 0.39 |
| 1147.0 | 0.386 |
| 1146.0 | 0.382 |
| 1145.0 | 0.378 |
| 1144.0 | 0.375 |
| 1143.0 | 0.373 |
| 1142.0 | 0.371 |
| 1141.0 | 0.37 |
| 1140.0 | 0.37 |
| 1139.0 | 0.369 |
| 1138.0 | 0.368 |
| 1137.0 | 0.365 |
| 1136.0 | 0.363 |
| 1135.0 | 0.362 |
| 1134.0 | 0.363 |
| 1133.0 | 0.365 |
| 1132.0 | 0.369 |
| 1131.0 | 0.374 |
| 1130.0 | 0.381 |
| 1129.0 | 0.388 |
| 1128.0 | 0.394 |
| 1127.0 | 0.398 |
| 1126.0 | 0.398 |
| 1125.0 | 0.395 |
| 1124.0 | 0.389 |
| 1123.0 | 0.381 |
| 1122.0 | 0.374 |
| 1121.0 | 0.37 |
| 1120.0 | 0.37 |
| 1119.0 | 0.377 |
| 1118.0 | 0.388 |
| 1117.0 | 0.404 |
| 1116.0 | 0.422 |
| 1115.0 | 0.438 |
| 1114.0 | 0.45 |
| 1113.0 | 0.456 |
| 1112.0 | 0.456 |
| 1111.0 | 0.451 |
| 1110.0 | 0.44 |
| 1109.0 | 0.427 |
| 1108.0 | 0.413 |
| 1107.0 | 0.402 |
| 1106.0 | 0.397 |
| 1105.0 | 0.395 |
| 1104.0 | 0.399 |
| 1103.0 | 0.405 |
| 1102.0 | 0.411 |
| 1101.0 | 0.416 |
| 1100.0 | 0.417 |
| 1099.0 | 0.414 |
| 1098.0 | 0.407 |
| 1097.0 | 0.397 |
| 1096.0 | 0.386 |
| 1095.0 | 0.375 |
| 1094.0 | 0.366 |
| 1093.0 | 0.359 |
| 1092.0 | 0.356 |
| 1091.0 | 0.356 |
| 1090.0 | 0.357 |
| 1089.0 | 0.358 |
| 1088.0 | 0.357 |
| 1087.0 | 0.355 |
| 1086.0 | 0.353 |
| 1085.0 | 0.35 |
| 1084.0 | 0.35 |
| 1083.0 | 0.353 |
| 1082.0 | 0.359 |
| 1081.0 | 0.369 |
| 1080.0 | 0.381 |
| 1079.0 | 0.393 |
| 1078.0 | 0.404 |
| 1077.0 | 0.412 |
| 1076.0 | 0.417 |
| 1075.0 | 0.419 |
| 1074.0 | 0.42 |
| 1073.0 | 0.421 |
| 1072.0 | 0.424 |
| 1071.0 | 0.43 |
| 1070.0 | 0.438 |
| 1069.0 | 0.446 |
| 1068.0 | 0.453 |
| 1067.0 | 0.456 |
| 1066.0 | 0.455 |
| 1065.0 | 0.45 |
| 1064.0 | 0.443 |
| 1063.0 | 0.436 |
| 1062.0 | 0.434 |
| 1061.0 | 0.437 |
| 1060.0 | 0.448 |
| 1059.0 | 0.465 |
| 1058.0 | 0.483 |
| 1057.0 | 0.501 |
| 1056.0 | 0.513 |
| 1055.0 | 0.518 |
| 1054.0 | 0.513 |
| 1053.0 | 0.499 |
| 1052.0 | 0.477 |
| 1051.0 | 0.452 |
| 1050.0 | 0.428 |
| 1049.0 | 0.413 |
| 1048.0 | 0.407 |
| 1047.0 | 0.412 |
| 1046.0 | 0.424 |
| 1045.0 | 0.44 |
| 1044.0 | 0.452 |
| 1043.0 | 0.456 |
| 1042.0 | 0.45 |
| 1041.0 | 0.432 |
| 1040.0 | 0.406 |
| 1039.0 | 0.376 |
| 1038.0 | 0.351 |
| 1037.0 | 0.334 |
| 1036.0 | 0.328 |
| 1035.0 | 0.332 |
| 1034.0 | 0.341 |
| 1033.0 | 0.349 |
| 1032.0 | 0.352 |
| 1031.0 | 0.347 |
| 1030.0 | 0.335 |
| 1029.0 | 0.32 |
| 1028.0 | 0.307 |
| 1027.0 | 0.301 |
| 1026.0 | 0.303 |
| 1025.0 | 0.314 |
| 1024.0 | 0.328 |
| 1023.0 | 0.342 |
| 1022.0 | 0.348 |
| 1021.0 | 0.347 |
| 1020.0 | 0.338 |
| 1019.0 | 0.325 |
| 1018.0 | 0.313 |
| 1017.0 | 0.309 |
| 1016.0 | 0.315 |
| 1015.0 | 0.331 |
| 1014.0 | 0.354 |
| 1013.0 | 0.377 |
| 1012.0 | 0.396 |
| 1011.0 | 0.405 |
| 1010.0 | 0.402 |
| 1009.0 | 0.39 |
| 1008.0 | 0.371 |
| 1007.0 | 0.352 |
| 1006.0 | 0.339 |
| 1005.0 | 0.335 |
| 1004.0 | 0.34 |
| 1003.0 | 0.352 |
| 1002.0 | 0.362 |
| 1001.0 | 0.367 |
| 1000.0 | 0.361 |
| 999.0 | 0.344 |
| 998.0 | 0.321 |
| 997.0 | 0.297 |
| 996.0 | 0.279 |
| 995.0 | 0.27 |
| 994.0 | 0.271 |
| 993.0 | 0.278 |
| 992.0 | 0.287 |
| 991.0 | 0.291 |
| 990.0 | 0.289 |
| 989.0 | 0.282 |
| 988.0 | 0.273 |
| 987.0 | 0.267 |
| 986.0 | 0.27 |
| 985.0 | 0.279 |
| 984.0 | 0.292 |
| 983.0 | 0.307 |
| 982.0 | 0.317 |
| 981.0 | 0.32 |
| 980.0 | 0.317 |
| 979.0 | 0.313 |
| 978.0 | 0.311 |
| 977.0 | 0.315 |
| 976.0 | 0.327 |
| 975.0 | 0.345 |
| 974.0 | 0.364 |
| 973.0 | 0.378 |
| 972.0 | 0.384 |
| 971.0 | 0.382 |
| 970.0 | 0.372 |
| 969.0 | 0.361 |
| 968.0 | 0.352 |
| 967.0 | 0.351 |
| 966.0 | 0.359 |
| 965.0 | 0.37 |
| 964.0 | 0.382 |
| 963.0 | 0.387 |
| 962.0 | 0.382 |
| 961.0 | 0.366 |
| 960.0 | 0.343 |
| 959.0 | 0.321 |
| 958.0 | 0.303 |
| 957.0 | 0.292 |
| 956.0 | 0.289 |
| 955.0 | 0.286 |
| 954.0 | 0.28 |
| 953.0 | 0.268 |
| 952.0 | 0.25 |
| 951.0 | 0.23 |
| 950.0 | 0.217 |
| 949.0 | 0.213 |
| 948.0 | 0.218 |
| 947.0 | 0.226 |
| 946.0 | 0.232 |
| 945.0 | 0.228 |
| 944.0 | 0.217 |
| 943.0 | 0.203 |
| 942.0 | 0.194 |
| 941.0 | 0.197 |
| 940.0 | 0.213 |
| 939.0 | 0.239 |
| 938.0 | 0.265 |
| 937.0 | 0.286 |
| 936.0 | 0.295 |
| 935.0 | 0.295 |
| 934.0 | 0.295 |
| 933.0 | 0.304 |
| 932.0 | 0.328 |
| 931.0 | 0.366 |
| 930.0 | 0.415 |
| 929.0 | 0.46 |
| 928.0 | 0.492 |
| 927.0 | 0.499 |
| 926.0 | 0.479 |
| 925.0 | 0.442 |
| 924.0 | 0.403 |
| 923.0 | 0.38 |
| 922.0 | 0.377 |
| 921.0 | 0.394 |
| 920.0 | 0.424 |
| 919.0 | 0.452 |
| 918.0 | 0.459 |
| 917.0 | 0.44 |
| 916.0 | 0.402 |
| 915.0 | 0.356 |
| 914.0 | 0.316 |
| 913.0 | 0.296 |
| 912.0 | 0.294 |
| 911.0 | 0.303 |
| 910.0 | 0.312 |
| 909.0 | 0.308 |
| 908.0 | 0.287 |
| 907.0 | 0.25 |
| 906.0 | 0.208 |
| 905.0 | 0.171 |
| 904.0 | 0.146 |
| 903.0 | 0.133 |
| 902.0 | 0.131 |
| 901.0 | 0.137 |
| 900.0 | 0.147 |
| 899.0 | 0.157 |
| 898.0 | 0.163 |
| 897.0 | 0.164 |
| 896.0 | 0.157 |
| 895.0 | 0.147 |
| 894.0 | 0.137 |
| 893.0 | 0.133 |
| 892.0 | 0.14 |
| 891.0 | 0.158 |
| 890.0 | 0.187 |
| 889.0 | 0.22 |
| 888.0 | 0.248 |
| 887.0 | 0.26 |
| 886.0 | 0.256 |
| 885.0 | 0.241 |
| 884.0 | 0.225 |
| 883.0 | 0.218 |
| 882.0 | 0.224 |
| 881.0 | 0.241 |
| 880.0 | 0.261 |
| 879.0 | 0.271 |
| 878.0 | 0.265 |
| 877.0 | 0.245 |
| 876.0 | 0.216 |
| 875.0 | 0.188 |
| 874.0 | 0.166 |
| 873.0 | 0.152 |
| 872.0 | 0.142 |
| 871.0 | 0.135 |
| 870.0 | 0.128 |
| 869.0 | 0.124 |
| 868.0 | 0.121 |
| 867.0 | 0.121 |
| 866.0 | 0.124 |
| 865.0 | 0.13 |
| 864.0 | 0.136 |
| 863.0 | 0.143 |
| 862.0 | 0.151 |
| 861.0 | 0.162 |
| 860.0 | 0.131 |
| 859.0 | 0.11 |
| 858.0 | 0.152 |
| 857.0 | 0.227 |
| 856.0 | 0.3 |
| 855.0 | 0.336 |
| 854.0 | 0.322 |
| 853.0 | 0.275 |
| 852.0 | 0.225 |
| 851.0 | 0.202 |
| 850.0 | 0.22 |
| 849.0 | 0.266 |
| 848.0 | 0.308 |
| 847.0 | 0.314 |
| 846.0 | 0.27 |
| 845.0 | 0.192 |
| 844.0 | 0.113 |
| 843.0 | 0.068 |
| 842.0 | 0.066 |
| 841.0 | 0.096 |
| 840.0 | 0.127 |
| 839.0 | 0.136 |
| 838.0 | 0.116 |
| 837.0 | 0.082 |
| 836.0 | 0.053 |
| 835.0 | 0.039 |
| 834.0 | 0.035 |
| 833.0 | 0.03 |
| 832.0 | 0.022 |
| 831.0 | 0.017 |
| 830.0 | 0.028 |
| 829.0 | 0.059 |
| 828.0 | 0.099 |
| 827.0 | 0.129 |
| 826.0 | 0.132 |
| 825.0 | 0.108 |
| 824.0 | 0.075 |
| 823.0 | 0.056 |
| 822.0 | 0.065 |
| 821.0 | 0.096 |
| 820.0 | 0.131 |
| 819.0 | 0.148 |
| 818.0 | 0.137 |
| 817.0 | 0.103 |
| 816.0 | 0.064 |
| 815.0 | 0.038 |
| 814.0 | 0.031 |
| 813.0 | 0.036 |
| 812.0 | 0.041 |
| 811.0 | 0.039 |
| 810.0 | 0.03 |
| 809.0 | 0.018 |
| 808.0 | 0.011 |
| 807.0 | 0.009 |
| 806.0 | 0.009 |
| 805.0 | 0.008 |
| 804.0 | 0.006 |
| 803.0 | 0.004 |
| 802.0 | 0.004 |
| 801.0 | 0.004 |
| 800.0 | 0.004 |
| 799.0 | 0.003 |
| 798.0 | 0.003 |
| 797.0 | 0.004 |
| 796.0 | 0.006 |
| 795.0 | 0.007 |
| 794.0 | 0.007 |
| 793.0 | 0.004 |
| 792.0 | 0.003 |
| 791.0 | 0.003 |
| 790.0 | 0.006 |
| 789.0 | 0.009 |
| 788.0 | 0.008 |
| 787.0 | 0.006 |
| 786.0 | 0.004 |
| 785.0 | 0.004 |
| 784.0 | 0.007 |
| 783.0 | 0.009 |
| 782.0 | 0.009 |
| 781.0 | 0.007 |
| 780.0 | 0.004 |
| 779.0 | 0.003 |
| 778.0 | 0.004 |
| 777.0 | 0.005 |
| 776.0 | 0.004 |
| 775.0 | 0.003 |
| 774.0 | 0.003 |
| 773.0 | 0.004 |
| 772.0 | 0.005 |
| 771.0 | 0.005 |
| 770.0 | 0.004 |
| 769.0 | 0.003 |
| 768.0 | 0.003 |
| 767.0 | 0.004 |
| 766.0 | 0.006 |
| 765.0 | 0.005 |
| 764.0 | 0.004 |
| 763.0 | 0.003 |
| 762.0 | 0.003 |
| 761.0 | 0.004 |
| 760.0 | 0.005 |
| 759.0 | 0.004 |
| 758.0 | 0.003 |
| 757.0 | 0.002 |
| 756.0 | 0.003 |
| 755.0 | 0.003 |
| 754.0 | 0.003 |
| 753.0 | 0.003 |
| 752.0 | 0.004 |
| 751.0 | 0.006 |
| 750.0 | 0.008 |
| 749.0 | 0.008 |
| 748.0 | 0.006 |
| 747.0 | 0.004 |
| 746.0 | 0.003 |
| 745.0 | 0.004 |
| 744.0 | 0.005 |
| 743.0 | 0.004 |
| 742.0 | 0.004 |
| 741.0 | 0.003 |
| 740.0 | 0.003 |
| 739.0 | 0.004 |
| 738.0 | 0.003 |
| 737.0 | 0.002 |
| 736.0 | 0.002 |
| 735.0 | 0.002 |
| 734.0 | 0.002 |
| 733.0 | 0.002 |
| 732.0 | 0.002 |
| 731.0 | 0.003 |
| 730.0 | 0.005 |
| 729.0 | 0.006 |
| 728.0 | 0.005 |
| 727.0 | 0.003 |
| 726.0 | 0.002 |
| 725.0 | 0.003 |
| 724.0 | 0.003 |
| 723.0 | 0.002 |
| 722.0 | 0.002 |
| 721.0 | 0.003 |
| 720.0 | 0.004 |
| 719.0 | 0.004 |
| 718.0 | 0.004 |
| 717.0 | 0.002 |
| 716.0 | 0.003 |
| 715.0 | 0.004 |
| 714.0 | 0.005 |
| 713.0 | 0.003 |
| 712.0 | 0.003 |
| 711.0 | 0.002 |
| 710.0 | 0.004 |
| 709.0 | 0.003 |
| 708.0 | 0.001 |
| 707.0 | 0.002 |
| 706.0 | 0.006 |
| 705.0 | 0.007 |
| 704.0 | 0.008 |
| 703.0 | 0.004 |
| 702.0 | 0.002 |
| 701.0 | 0.003 |
| 700.0 | 0.007 |
| 699.0 | 0.005 |
| 698.0 | 0.002 |
| 697.0 | 0 |
| 696.0 | 0.005 |
| 695.0 | 0.004 |
| 694.0 | 0.003 |
| 693.0 | 0.003 |
| 692.0 | 0.005 |
| 691.0 | 0.004 |
| 690.0 | 0.002 |
| 689.0 | 0.002 |
| 688.0 | 0.006 |
| 687.0 | 0.008 |
| 686.0 | 0.006 |
| 685.0 | 0 |
| 684.0 | 0.002 |
| 683.0 | 0.005 |
| 682.0 | 0.007 |
| 681.0 | 0.005 |
| 680.0 | 0.004 |
| 679.0 | 0.003 |
| 678.0 | 0.005 |
| 677.0 | 0.002 |
| 676.0 | 0.002 |
| 675.0 | 0.005 |
| 674.0 | 0.005 |
| 673.0 | 0.005 |
| 672.0 | 0.004 |
| 671.0 | 0.005 |
| 670.0 | 0.006 |
| 669.0 | 0.005 |
| 668.0 | 0.004 |
| 667.0 | 0.004 |
| 666.0 | 0.005 |
| 665.0 | 0.006 |
| 664.0 | 0.004 |
| 663.0 | 0.001 |
| 662.0 | 0.004 |
| 661.0 | 0.008 |
| 660.0 | 0.005 |
| 659.0 | 0.004 |
| 658.0 | 0.004 |
| 657.0 | 0.003 |
| 656.0 | 0.005 |
| 655.0 | 0.001 |
| 654.0 | 0 |
| 653.0 | 0.004 |
| 652.0 | 0.005 |
| 651.0 | 0.003 |
| 650.0 | 0.006 |
| 649.0 | 0.008 |
| 648.0 | 0.005 |
| 647.0 | 0.004 |
| 646.0 | 0.006 |
| 645.0 | 0.006 |
| 644.0 | 0.003 |
| 643.0 | 0.002 |
| 642.0 | 0.002 |
| 641.0 | 0.001 |
| 640.0 | 0.004 |
| 639.0 | 0.002 |
| 638.0 | 0.003 |
| 637.0 | 0.003 |
| 636.0 | 0.002 |
| 635.0 | 0.003 |
| 634.0 | 0.003 |
| 633.0 | 0 |
| 632.0 | 0.007 |
| 631.0 | 0.01 |
| 630.0 | 0.006 |
| 629.0 | 0.004 |
| 628.0 | 0.002 |
| 627.0 | 0.002 |
| 626.0 | 0.004 |
| 625.0 | 0.002 |
| 624.0 | 0 |
| 623.0 | 0.003 |
| 622.0 | 0.001 |
| 621.0 | 0.001 |
| 620.0 | 0.003 |
| 619.0 | 0.002 |
| 618.0 | 0.002 |
| 617.0 | 0.003 |
| 616.0 | 0.005 |
| 615.0 | 0.003 |
| 614.0 | 0.003 |
| 613.0 | 0.008 |
| 612.0 | 0.007 |
| 611.0 | 0.004 |
| 610.0 | 0.002 |
| 609.0 | 0.002 |
| 608.0 | 0.001 |
| 607.0 | 0.005 |
| 606.0 | 0.004 |
| 605.0 | 0.003 |
| 604.0 | 0.003 |
| 603.0 | 0.003 |
| 602.0 | 0.006 |
| 601.0 | 0.005 |
| 600.0 | 0.003 |
| 599.0 | 0.006 |
| 598.0 | 0.006 |
| 597.0 | 0.002 |
| 596.0 | 0.004 |
| 595.0 | 0.007 |
| 594.0 | 0.007 |
| 593.0 | 0.005 |
| 592.0 | 0.004 |
| 591.0 | 0.006 |
| 590.0 | 0.008 |
| 589.0 | 0.005 |
| 588.0 | 0.004 |
| 587.0 | 0.008 |
| 586.0 | 0.008 |
| 585.0 | 0.007 |
| 584.0 | 0.007 |
| 583.0 | 0.007 |
| 582.0 | 0.005 |
| 581.0 | 0.005 |
| 580.0 | 0.007 |
| 579.0 | 0.006 |
| 578.0 | 0.005 |
| 577.0 | 0.005 |
| 576.0 | 0.006 |
| 575.0 | 0.006 |
| 574.0 | 0.007 |
| 573.0 | 0.007 |
| 572.0 | 0.006 |
| 571.0 | 0.008 |
| 570.0 | 0.008 |
| 569.0 | 0.007 |
| 568.0 | 0.009 |
| 567.0 | 0.009 |
| 566.0 | 0.009 |
| 565.0 | 0.01 |
| 564.0 | 0.008 |
| 563.0 | 0.008 |
| 562.0 | 0.009 |
| 561.0 | 0.008 |
| 560.0 | 0.009 |
| 559.0 | 0.009 |
| 558.0 | 0.007 |
| 557.0 | 0.01 |
| 556.0 | 0.01 |
| 555.0 | 0.011 |
| 554.0 | 0.014 |
| 553.0 | 0.009 |
| 552.0 | 0.005 |
| 551.0 | 0.005 |
| 550.0 | 0.009 |
| 549.0 | 0.01 |
| 548.0 | 0.005 |
| 547.0 | 0.007 |
| 546.0 | 0.011 |
| 545.0 | 0.019 |
| 544.0 | 0.045 |
| 543.0 | 0.132 |
| 542.0 | 0.354 |
| 541.0 | 0.837 |
| 540.0 | 2.65 |
| 539.0 | 3.567 |
| 538.0 | 4.292 |
| 537.0 | 5.22 |
| 536.0 | 5.983 |
| 535.0 | 6.042 |
| 534.0 | 6.061 |
| 533.0 | 6.039 |
| 532.0 | 6.088 |
| 531.0 | 5.355 |
| 530.0 | 4.304 |
| 529.0 | 3.474 |
| 528.0 | 2.317 |
| 527.0 | 0.825 |
| 526.0 | 0.236 |
| 525.0 | 0.034 |
| 524.0 | 0.017 |
| 523.0 | 0.017 |
| 522.0 | 0.011 |
| 521.0 | 0.008 |
| 520.0 | 0.006 |
| 519.0 | 0.006 |
| 518.0 | 0.007 |
| 517.0 | 0.008 |
| 516.0 | 0.009 |
| 515.0 | 0.013 |
| 514.0 | 0.018 |
| 513.0 | 0.016 |
| 512.0 | 0.016 |
| 511.0 | 0.015 |
| 510.0 | 0.015 |
| 509.0 | 0.014 |
| 508.0 | 0.014 |
| 507.0 | 0.013 |
| 506.0 | 0.013 |
| 505.0 | 0.013 |
| 504.0 | 0.012 |
| 503.0 | 0.011 |
| 502.0 | 0.012 |
| 501.0 | 0.013 |
| 500.0 | 0.012 |
| 499.0 | 0.013 |
| 498.0 | 0.01 |
| 497.0 | 0.009 |
| 496.0 | 0.012 |
| 495.0 | 0.012 |
| 494.0 | 0.011 |
| 493.0 | 0.01 |
| 492.0 | 0.009 |
| 491.0 | 0.009 |
| 490.0 | 0.01 |
| 489.0 | 0.009 |
| 488.0 | 0.009 |
| 487.0 | 0.009 |
| 486.0 | 0.01 |
| 485.0 | 0.009 |
| 484.0 | 0.008 |
| 483.0 | 0.008 |
| 482.0 | 0.008 |
| 481.0 | 0.008 |
| 480.0 | 0.008 |
| 479.0 | 0.009 |
| 478.0 | 0.011 |
| 477.0 | 0.011 |
| 476.0 | 0.009 |
| 475.0 | 0.008 |
| 474.0 | 0.01 |
| 473.0 | 0.01 |
| 472.0 | 0.009 |
| 471.0 | 0.008 |
| 470.0 | 0.009 |
| 469.0 | 0.012 |
| 468.0 | 0.014 |
| 467.0 | 0.013 |
| 466.0 | 0.011 |
| 465.0 | 0.009 |
| 464.0 | 0.011 |
| 463.0 | 0.013 |
| 462.0 | 0.012 |
| 461.0 | 0.014 |
| 460.0 | 0.014 |
| 459.0 | 0.012 |
| 458.0 | 0.01 |
| 457.0 | 0.012 |
| 456.0 | 0.013 |
| 455.0 | 0.013 |
| 454.0 | 0.014 |
| 453.0 | 0.013 |
| 452.0 | 0.011 |
| 451.0 | 0.012 |
| 450.0 | 0.011 |
| 449.0 | 0.013 |
| 448.0 | 0.016 |
| 447.0 | 0.016 |
| 446.0 | 0.015 |
| 445.0 | 0.015 |
| 444.0 | 0.014 |
| 443.0 | 0.012 |
| 442.0 | 0.015 |
| 441.0 | 0.014 |
| 440.0 | 0.013 |
| 439.0 | 0.012 |
| 438.0 | 0.015 |
| 437.0 | 0.015 |
| 436.0 | 0.017 |
| 435.0 | 0.018 |
| 434.0 | 0.019 |
| 433.0 | 0.018 |
| 432.0 | 0.013 |
| 431.0 | 0.015 |
| 430.0 | 0.02 |
| 429.0 | 0.019 |
| 428.0 | 0.018 |
| 427.0 | 0.017 |
| 426.0 | 0.017 |
| 425.0 | 0.019 |
| 424.0 | 0.02 |
| 423.0 | 0.019 |
| 422.0 | 0.019 |
| 421.0 | 0.016 |
| 420.0 | 0.017 |
| 419.0 | 0.018 |
| 418.0 | 0.018 |
| 417.0 | 0.018 |
| 416.0 | 0.018 |
| 415.0 | 0.023 |
| 414.0 | 0.024 |
| 413.0 | 0.024 |
| 412.0 | 0.024 |
| 411.0 | 0.028 |
| 410.0 | 0.027 |
| 409.0 | 0.028 |
| 408.0 | 0.032 |
| 407.0 | 0.032 |
| 406.0 | 0.033 |
| 405.0 | 0.033 |
| 404.0 | 0.032 |
| 403.0 | 0.038 |
| 402.0 | 0.043 |
| 401.0 | 0.044 |
| 400.0 | 0.043 |
| 399.0 | 0.061 |
| 398.0 | 0.063 |
| 397.0 | 0.067 |
| 396.0 | 0.072 |
| 395.0 | 0.08 |
| 394.0 | 0.09 |
| 393.0 | 0.102 |
| 392.0 | 0.112 |
| 391.0 | 0.119 |
| 390.0 | 0.126 |
| 389.0 | 0.14 |
| 388.0 | 0.188 |
| 387.0 | 0.306 |
| 386.0 | 0.514 |
| 385.0 | 0.812 |
| 384.0 | 1.196 |
| 383.0 | 1.684 |
| 382.0 | 2.326 |
| 381.0 | 3.21 |
| 380.0 | 4.451 |
| 379.0 | 5.164 |
| 378.0 | 4.448 |
| 377.0 | 4.408 |
| 376.0 | 4.559 |
| 375.0 | 4.793 |
| 374.0 | 4.577 |
| 373.0 | 4.939 |
| 372.0 | 5.24 |
| 371.0 | 4.407 |
| 370.0 | 4.336 |
| 369.0 | 4.637 |
| 368.0 | 4.576 |
| 367.0 | 4.859 |
| 366.0 | 5.636 |
| 365.0 | 4.432 |
| 364.0 | 4.346 |
| 363.0 | 4.636 |
| 362.0 | 4.489 |
| 361.0 | 4.706 |
| 360.0 | 4.895 |
| 359.0 | 4.334 |
| 358.0 | 4.237 |
| 357.0 | 4.219 |
| 356.0 | 4.302 |
| 355.0 | 4.417 |
| 354.0 | 4.856 |
| 353.0 | 4.301 |
| 352.0 | 4.236 |
| 351.0 | 4.704 |
| 350.0 | 4.343 |
| 349.0 | 4.893 |
| 348.0 | 5.031 |
| 347.0 | 4.321 |
| 346.0 | 4.28 |
| 345.0 | 4.27 |
| 344.0 | 4.299 |
| 343.0 | 4.786 |
| 342.0 | 4.891 |
| 341.0 | 4.388 |
| 340.0 | 4.139 |
| 339.0 | 4.329 |
| 338.0 | 4.363 |
| 337.0 | 4.852 |
| 336.0 | 4.89 |
| 335.0 | 4.329 |
| 334.0 | 4.198 |
| 333.0 | 4.784 |
| 332.0 | 4.277 |
| 331.0 | 4.608 |
| 330.0 | 4.675 |
| 329.0 | 4.424 |
| 328.0 | 4.213 |
| 327.0 | 4.385 |
| 326.0 | 4.306 |
| 325.0 | 4.815 |
| 324.0 | 4.753 |
| 323.0 | 4.41 |
| 322.0 | 4.157 |
| 321.0 | 4.886 |
| 320.0 | 4.238 |
| 319.0 | 4.928 |
| 318.0 | 4.494 |
| 317.0 | 4.253 |
| 316.0 | 4.322 |
| 315.0 | 4.526 |
| 314.0 | 4.433 |
| 313.0 | 4.623 |
| 312.0 | 5.321 |
| 311.0 | 4.392 |
| 310.0 | 4.233 |
| 309.0 | 4.718 |
| 308.0 | 4.366 |
| 307.0 | 4.56 |
| 306.0 | 5.921 |
| 305.0 | 4.298 |
| 304.0 | 4.341 |
| 303.0 | 4.559 |
| 302.0 | 4.364 |
| 301.0 | 4.879 |
| 300.0 | 5.318 |
| 299.0 | 4.364 |
| 298.0 | 4.328 |
| 297.0 | 4.577 |
| 296.0 | 4.363 |
| 295.0 | 4.965 |
| 294.0 | 5.22 |
| 293.0 | 4.35 |
| 292.0 | 4.228 |
| 291.0 | 4.741 |
| 290.0 | 4.245 |
| 289.0 | 5.072 |
| 288.0 | 5.139 |
| 287.0 | 4.304 |
| 286.0 | 4.192 |
| 285.0 | 4.536 |
| 284.0 | 4.253 |
| 283.0 | 5.439 |
| 282.0 | 4.769 |
| 281.0 | 4.383 |
| 280.0 | 4.151 |
| 279.0 | 5.914 |
| 278.0 | 4.233 |
| 277.0 | 5.613 |
| 276.0 | 4.872 |
| 275.0 | 4.451 |
| 274.0 | 4.189 |
| 273.0 | 4.871 |
| 272.0 | 4.135 |
| 271.0 | 5.435 |
| 270.0 | 4.394 |
| 269.0 | 4.3 |
| 268.0 | 4.196 |
| 267.0 | 4.497 |
| 266.0 | 4.497 |
| 265.0 | 4.958 |
| 264.0 | 4.708 |
| 263.0 | 4.299 |
| 262.0 | 4.239 |
| 261.0 | 4.496 |
| 260.0 | 4.187 |
| 259.0 | 5.434 |
| 258.0 | 4.869 |
| 257.0 | 4.203 |
| 256.0 | 4.154 |
| 255.0 | 4.228 |
| 254.0 | 4.296 |
| 253.0 | 5.063 |
| 252.0 | 4.794 |
| 251.0 | 4.2 |
| 250.0 | 4.108 |
| 249.0 | 4.606 |
| 248.0 | 4.235 |
| 247.0 | 5.128 |
| 246.0 | 5.606 |
| 245.0 | 4.198 |
| 244.0 | 4.207 |
| 243.0 | 4.458 |
| 242.0 | 4.282 |
| 241.0 | 4.827 |
| 240.0 | 4.73 |
| 239.0 | 4.198 |
| 238.0 | 4.157 |
| 237.0 | 4.4 |
| 236.0 | 4.491 |
| 235.0 | 4.792 |
| 234.0 | 4.826 |
| 233.0 | 4.149 |
| 232.0 | 4.233 |
| 231.0 | 4.399 |
| 230.0 | 4.271 |
| 229.0 | 4.7 |
| 228.0 | 4.648 |
| 227.0 | 4.146 |
| 226.0 | 4.299 |
| 225.0 | 4.396 |
| 224.0 | 4.344 |
| 223.0 | 4.538 |
| 222.0 | 4.694 |
| 221.0 | 4.207 |
| 220.0 | 4.198 |
| 219.0 | 4.364 |
| 218.0 | 4.363 |
| 217.0 | 4.639 |
| 216.0 | 4.638 |
| 215.0 | 4.073 |
| 214.0 | 4.193 |
| 213.0 | 4.289 |
| 212.0 | 4.218 |
| 211.0 | 4.61 |
| 210.0 | 4.426 |
| 209.0 | 4.18 |
| 208.0 | 4.116 |
| 207.0 | 4.423 |
| 206.0 | 4.195 |
| 205.0 | 4.469 |
| 204.0 | 4.293 |
| 203.0 | 4.002 |
| 202.0 | 4.001 |
| 201.0 | 4.209 |
| 200.0 | 3.972 |